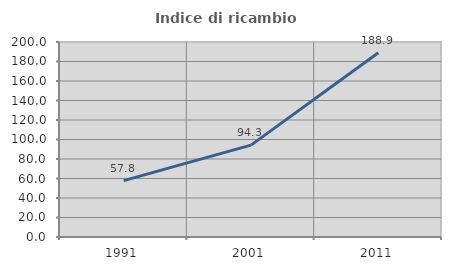
| Category | Indice di ricambio occupazionale  |
|---|---|
| 1991.0 | 57.798 |
| 2001.0 | 94.253 |
| 2011.0 | 188.889 |